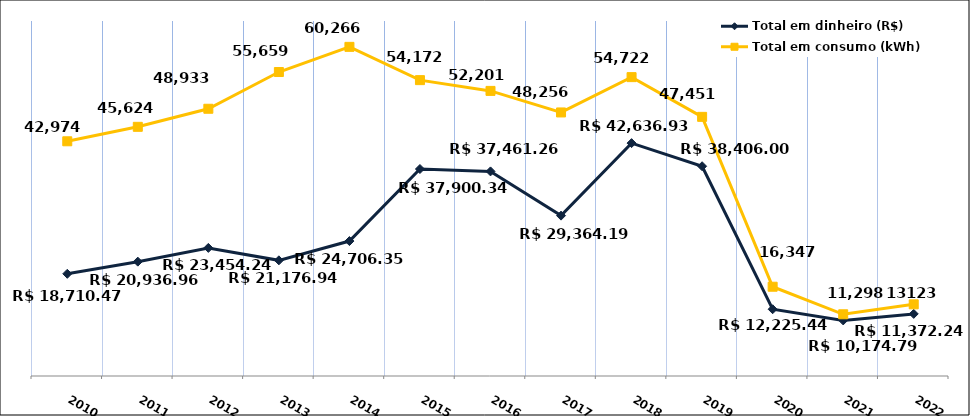
| Category | Total em dinheiro (R$) |
|---|---|
| 2010.0 | 18710.47 |
| 2011.0 | 20936.96 |
| 2012.0 | 23454.24 |
| 2013.0 | 21176.94 |
| 2014.0 | 24706.35 |
| 2015.0 | 37900.34 |
| 2016.0 | 37461.26 |
| 2017.0 | 29364.19 |
| 2018.0 | 42636.93 |
| 2019.0 | 38406 |
| 2020.0 | 12225.44 |
| 2021.0 | 10174.79 |
| 2022.0 | 11372.24 |